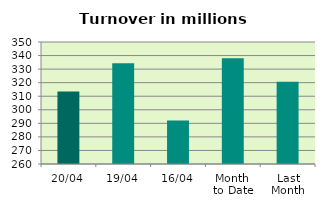
| Category | Series 0 |
|---|---|
| 20/04 | 313.427 |
| 19/04 | 334.378 |
| 16/04 | 292.086 |
| Month 
to Date | 338.044 |
| Last
Month | 320.663 |